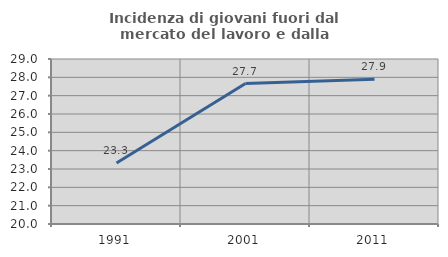
| Category | Incidenza di giovani fuori dal mercato del lavoro e dalla formazione  |
|---|---|
| 1991.0 | 23.326 |
| 2001.0 | 27.659 |
| 2011.0 | 27.899 |